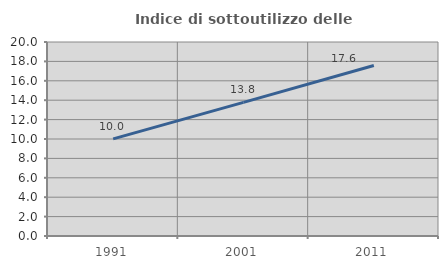
| Category | Indice di sottoutilizzo delle abitazioni  |
|---|---|
| 1991.0 | 10.012 |
| 2001.0 | 13.77 |
| 2011.0 | 17.583 |